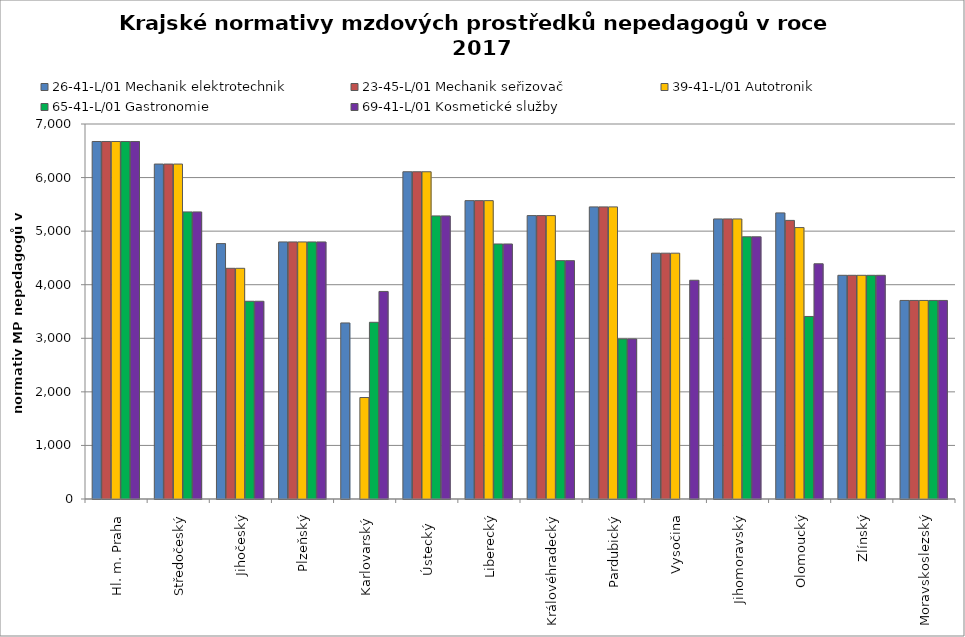
| Category | 26-41-L/01 Mechanik elektrotechnik | 23-45-L/01 Mechanik seřizovač | 39-41-L/01 Autotronik | 65-41-L/01 Gastronomie | 69-41-L/01 Kosmetické služby |
|---|---|---|---|---|---|
| Hl. m. Praha | 6673.433 | 6673.433 | 6673.433 | 6673.433 | 6673.433 |
| Středočeský | 6252.308 | 6252.308 | 6252.308 | 5358.894 | 5358.894 |
| Jihočeský | 4767.548 | 4306.393 | 4306.393 | 3691.068 | 3691.068 |
| Plzeňský | 4798.558 | 4798.558 | 4798.558 | 4798.558 | 4798.558 |
| Karlovarský  | 3286.435 | 0 | 1894.346 | 3298.599 | 3874.235 |
| Ústecký   | 6108.424 | 6108.424 | 6108.424 | 5284.339 | 5284.339 |
| Liberecký | 5569.454 | 5569.454 | 5569.454 | 4760.525 | 4760.525 |
| Královéhradecký | 5290.132 | 5290.132 | 5290.132 | 4449.118 | 4449.118 |
| Pardubický | 5452.5 | 5452.5 | 5452.5 | 2987.671 | 2987.671 |
| Vysočina | 4588.781 | 4588.781 | 4588.781 | 0 | 4083.305 |
| Jihomoravský | 5227.831 | 5227.831 | 5227.831 | 4894.525 | 4894.525 |
| Olomoucký | 5340.468 | 5200.628 | 5066.633 | 3407.308 | 4391.156 |
| Zlínský | 4175.51 | 4175.51 | 4175.51 | 4175.51 | 4175.51 |
| Moravskoslezský | 3706.47 | 3706.47 | 3706.47 | 3706.47 | 3706.47 |